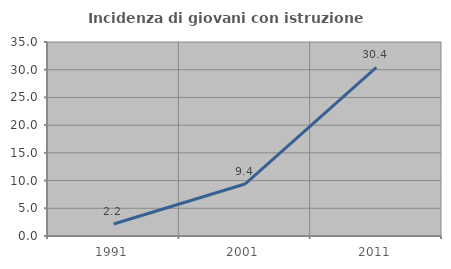
| Category | Incidenza di giovani con istruzione universitaria |
|---|---|
| 1991.0 | 2.174 |
| 2001.0 | 9.375 |
| 2011.0 | 30.435 |